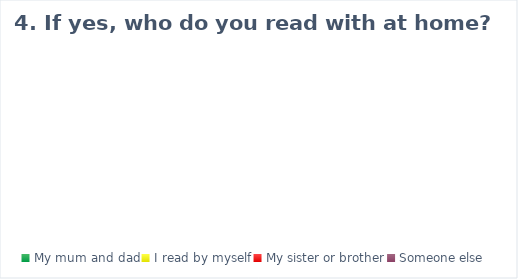
| Category | Series 0 |
|---|---|
| My mum and dad | 0 |
| I read by myself | 0 |
| My sister or brother | 0 |
| Someone else | 0 |